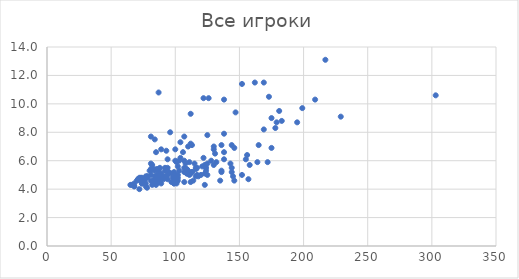
| Category | Цена, млн. £ |
|---|---|
| 172.0 | 5.9 |
| 158.0 | 5.7 |
| 157.0 | 4.7 |
| 152.0 | 5 |
| 146.0 | 4.6 |
| 145.0 | 4.9 |
| 144.0 | 5.5 |
| 136.0 | 5.3 |
| 135.0 | 4.6 |
| 125.0 | 5 |
| 124.0 | 5.3 |
| 123.0 | 4.3 |
| 123.0 | 5.1 |
| 112.0 | 4.5 |
| 99.0 | 4.4 |
| 88.0 | 4.9 |
| 73.0 | 4.6 |
| 72.0 | 4 |
| 175.0 | 6.9 |
| 165.0 | 7.1 |
| 156.0 | 6.4 |
| 146.0 | 6.9 |
| 143.0 | 5.8 |
| 138.0 | 6.1 |
| 138.0 | 6.6 |
| 132.0 | 5.9 |
| 131.0 | 6.5 |
| 130.0 | 5.7 |
| 123.0 | 5.7 |
| 118.0 | 4.9 |
| 117.0 | 5.5 |
| 116.0 | 4.9 |
| 116.0 | 5.5 |
| 115.0 | 5.8 |
| 114.0 | 4.6 |
| 113.0 | 5.2 |
| 112.0 | 5.1 |
| 111.0 | 5 |
| 110.0 | 5.3 |
| 109.0 | 5.4 |
| 108.0 | 5.8 |
| 107.0 | 4.5 |
| 107.0 | 6 |
| 103.0 | 5.3 |
| 102.0 | 4.6 |
| 102.0 | 4.8 |
| 102.0 | 5 |
| 101.0 | 4.6 |
| 101.0 | 4.6 |
| 100.0 | 4.6 |
| 100.0 | 5 |
| 100.0 | 6 |
| 99.0 | 4.4 |
| 97.0 | 4.5 |
| 95.0 | 5.2 |
| 94.0 | 4.7 |
| 90.0 | 4.9 |
| 90.0 | 4.9 |
| 89.0 | 4.4 |
| 89.0 | 5 |
| 88.0 | 4.5 |
| 87.0 | 4.8 |
| 87.0 | 5.4 |
| 86.0 | 4.5 |
| 86.0 | 5 |
| 85.0 | 4.5 |
| 85.0 | 4.7 |
| 84.0 | 4.5 |
| 83.0 | 4.4 |
| 83.0 | 4.6 |
| 82.0 | 5.7 |
| 81.0 | 4.6 |
| 81.0 | 5.3 |
| 81.0 | 5.4 |
| 78.0 | 4.1 |
| 78.0 | 4.9 |
| 77.0 | 4.2 |
| 76.0 | 4.6 |
| 74.0 | 4.4 |
| 72.0 | 4.8 |
| 71.0 | 4.7 |
| 68.0 | 4.2 |
| 68.0 | 4.4 |
| 66.0 | 4.3 |
| 65.0 | 4.3 |
| 303.0 | 10.6 |
| 229.0 | 9.1 |
| 209.0 | 10.3 |
| 199.0 | 9.7 |
| 195.0 | 8.7 |
| 179.0 | 8.7 |
| 178.0 | 8.3 |
| 175.0 | 9 |
| 173.0 | 10.5 |
| 169.0 | 8.2 |
| 164.0 | 5.9 |
| 155.0 | 6.1 |
| 152.0 | 11.4 |
| 147.0 | 9.4 |
| 144.0 | 5.2 |
| 144.0 | 7.1 |
| 138.0 | 7.9 |
| 136.0 | 5.2 |
| 136.0 | 7.1 |
| 130.0 | 6.8 |
| 130.0 | 7 |
| 128.0 | 6 |
| 125.0 | 5.8 |
| 125.0 | 7.8 |
| 122.0 | 6.2 |
| 121.0 | 5.6 |
| 120.0 | 5 |
| 117.0 | 5 |
| 116.0 | 5.4 |
| 113.0 | 5.2 |
| 112.0 | 7.2 |
| 112.0 | 9.3 |
| 109.0 | 5.1 |
| 109.0 | 5.1 |
| 107.0 | 5.2 |
| 107.0 | 5.5 |
| 107.0 | 7.7 |
| 106.0 | 6.6 |
| 101.0 | 4.4 |
| 101.0 | 4.9 |
| 101.0 | 5.9 |
| 100.0 | 4.5 |
| 100.0 | 6.8 |
| 98.0 | 4.8 |
| 97.0 | 5.1 |
| 96.0 | 8 |
| 94.0 | 5.5 |
| 92.0 | 4.9 |
| 91.0 | 4.7 |
| 89.0 | 4.8 |
| 89.0 | 5.1 |
| 89.0 | 6.8 |
| 88.0 | 5.5 |
| 87.0 | 4.5 |
| 87.0 | 4.8 |
| 87.0 | 5.3 |
| 86.0 | 5 |
| 85.0 | 4.3 |
| 85.0 | 4.6 |
| 85.0 | 4.7 |
| 85.0 | 5.4 |
| 85.0 | 6.6 |
| 84.0 | 4.9 |
| 84.0 | 5.3 |
| 82.0 | 4.3 |
| 82.0 | 5.4 |
| 82.0 | 5.5 |
| 81.0 | 5 |
| 81.0 | 5.4 |
| 81.0 | 5.8 |
| 81.0 | 7.7 |
| 80.0 | 5.3 |
| 78.0 | 4.8 |
| 78.0 | 4.9 |
| 77.0 | 4.4 |
| 77.0 | 4.9 |
| 75.0 | 4.7 |
| 74.0 | 4.4 |
| 74.0 | 4.8 |
| 73.0 | 4.6 |
| 71.0 | 4.7 |
| 70.0 | 4.6 |
| 68.0 | 4.2 |
| 217.0 | 13.1 |
| 183.0 | 8.8 |
| 181.0 | 9.5 |
| 169.0 | 11.5 |
| 162.0 | 11.5 |
| 138.0 | 10.3 |
| 126.0 | 10.4 |
| 124.0 | 5.5 |
| 122.0 | 10.4 |
| 113.0 | 7.1 |
| 111.0 | 5.9 |
| 110.0 | 7 |
| 109.0 | 5.4 |
| 108.0 | 5.4 |
| 104.0 | 6.2 |
| 104.0 | 7.3 |
| 103.0 | 6 |
| 102.0 | 5.6 |
| 99.0 | 5.2 |
| 94.0 | 5 |
| 94.0 | 6.1 |
| 93.0 | 6.7 |
| 92.0 | 5.3 |
| 92.0 | 5.5 |
| 88.0 | 4.9 |
| 87.0 | 10.8 |
| 86.0 | 5.4 |
| 84.0 | 7.5 |
| 83.0 | 4.6 |
| 73.0 | 4.8 |